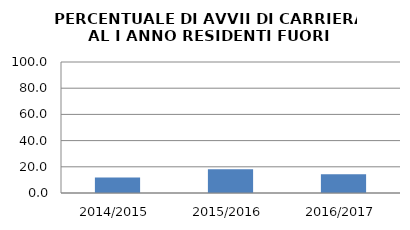
| Category | 2014/2015 2015/2016 2016/2017 |
|---|---|
| 2014/2015 | 11.765 |
| 2015/2016 | 18.182 |
| 2016/2017 | 14.286 |